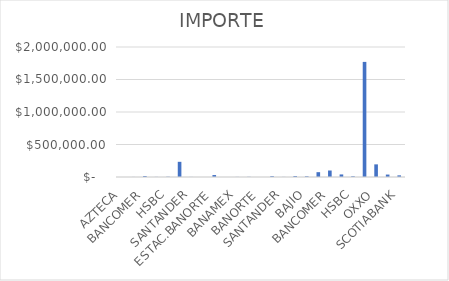
| Category | IMPORTE |
|---|---|
| AZTECA | 112.12 |
| BANAMEX | 965.4 |
| BANCOMER | 15167.88 |
| BANORTE | 1702.07 |
| HSBC | 4337.82 |
| INTERNET | 233652.25 |
| SANTANDER | 1111.59 |
| OXXO | 236 |
| ESTAC.BANORTE | 30030.5 |
| AZTECA | 406 |
| BANAMEX | 1624 |
| BANCOMER | 2842 |
| BANORTE | 406 |
| INTERNET | 13504.21 |
| SANTANDER | 1624 |
| AZTECA | 15328.26 |
| BAJIO | 11431.05 |
| BANAMEX | 74303.81 |
| BANCOMER | 99827.87 |
| BANORTE | 39391.72 |
| HSBC | 11414.28 |
| INTERNET | 1770854.09 |
| OXXO | 194344.88 |
| SANTANDER | 37528.74 |
| SCOTIABANK | 25203.28 |